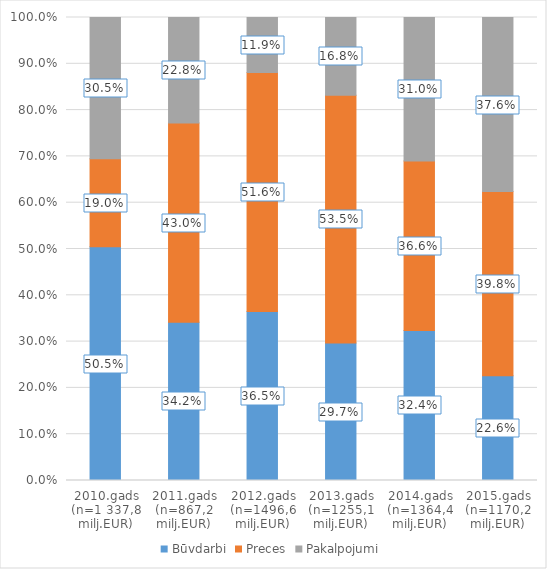
| Category | Būvdarbi | Preces | Pakalpojumi |
|---|---|---|---|
| 2010.gads (n=1 337,8 milj.EUR) | 0.505 | 0.19 | 0.305 |
| 2011.gads (n=867,2 milj.EUR) | 0.342 | 0.43 | 0.228 |
| 2012.gads (n=1496,6 milj.EUR) | 0.365 | 0.516 | 0.119 |
| 2013.gads (n=1255,1 milj.EUR) | 0.297 | 0.535 | 0.168 |
| 2014.gads (n=1364,4 milj.EUR) | 0.324 | 0.366 | 0.31 |
| 2015.gads (n=1170,2 milj.EUR) | 0.226 | 0.398 | 0.376 |